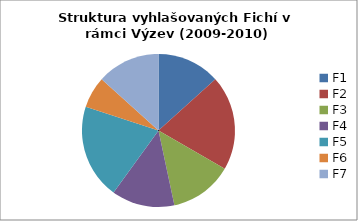
| Category | Struktura vyhlašovaných Fichí v rámci Výzev (2009-2010) |
|---|---|
| F1 | 2 |
| F2 | 3 |
| F3 | 2 |
| F4 | 2 |
| F5 | 3 |
| F6 | 1 |
| F7 | 2 |